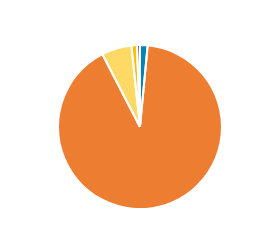
| Category | Series 0 |
|---|---|
| PC/MC | 150 |
| CAR/LGV | 9155 |
| OGV1 & PSV 2Axle | 595 |
| OGV1 & PSV 3 Axle | 110 |
| OGV2 | 60 |